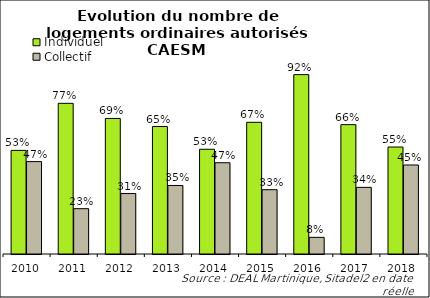
| Category | Individuel | Collectif |
|---|---|---|
| 2010.0 | 0.529 | 0.471 |
| 2011.0 | 0.769 | 0.231 |
| 2012.0 | 0.692 | 0.308 |
| 2013.0 | 0.65 | 0.35 |
| 2014.0 | 0.534 | 0.466 |
| 2015.0 | 0.672 | 0.328 |
| 2016.0 | 0.915 | 0.085 |
| 2017.0 | 0.66 | 0.34 |
| 2018.0 | 0.546 | 0.454 |